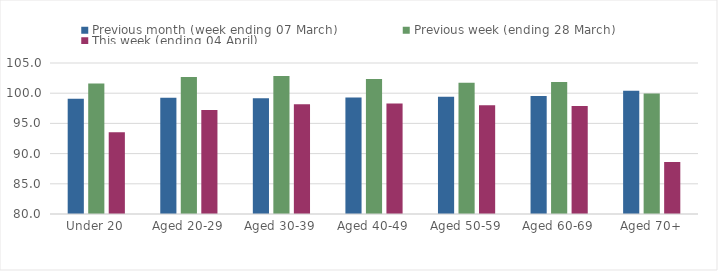
| Category | Previous month (week ending 07 March) | Previous week (ending 28 March) | This week (ending 04 April) |
|---|---|---|---|
| Under 20 | 99.067 | 101.588 | 93.55 |
| Aged 20-29 | 99.26 | 102.696 | 97.237 |
| Aged 30-39 | 99.17 | 102.834 | 98.171 |
| Aged 40-49 | 99.306 | 102.346 | 98.289 |
| Aged 50-59 | 99.421 | 101.723 | 98.011 |
| Aged 60-69 | 99.544 | 101.85 | 97.899 |
| Aged 70+ | 100.426 | 99.932 | 88.601 |